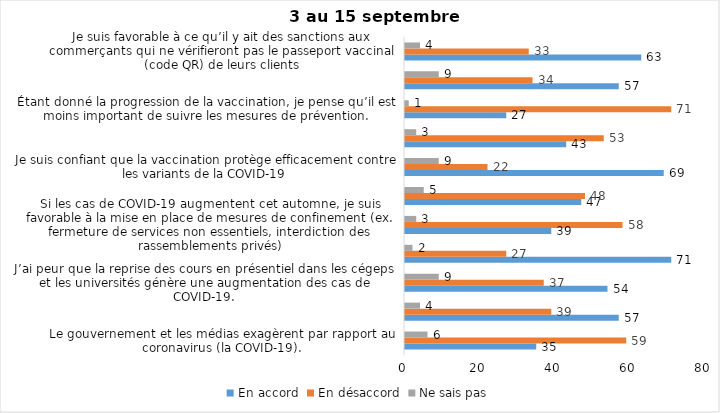
| Category | En accord | En désaccord | Ne sais pas |
|---|---|---|---|
| Le gouvernement et les médias exagèrent par rapport au coronavirus (la COVID-19). | 35 | 59 | 6 |
| J’ai peur que le système de santé soit débordé par les cas de COVID-19 suite au "déconfinement" | 57 | 39 | 4 |
| J’ai peur que la reprise des cours en présentiel dans les cégeps et les universités génère une augmentation des cas de COVID-19. | 54 | 37 | 9 |
| Je suis favorable au passeport vaccinal qui permettrait l'accès à certains lieux ou activités aux personnes vaccinées. | 71 | 27 | 2 |
| Si les cas de COVID-19 augmentent cet automne, je suis favorable à la mise en place de mesures de confinement (ex. fermeture de services non essentiels, interdiction des rassemblements privés) | 39 | 58 | 3 |
| Je suis inquiet de contracter le variant Delta de la Covid-19 | 47 | 48 | 5 |
| Je suis confiant que la vaccination protège efficacement contre les variants de la COVID-19 | 69 | 22 | 9 |
| Je suis favorable à ce que le port du masque ne soit plus obligatoire au Québec. | 43 | 53 | 3 |
| Étant donné la progression de la vaccination, je pense qu’il est moins important de suivre les mesures de prévention. | 27 | 71 | 1 |
| J'ai peur que la reprise des cours en présentiel dans les écoles primaires et secondaires génère une augmentation des cas de COVID-19 | 57 | 34 | 9 |
| Je suis favorable à ce qu’il y ait des sanctions aux commerçants qui ne vérifieront pas le passeport vaccinal (code QR) de leurs clients | 63 | 33 | 4 |